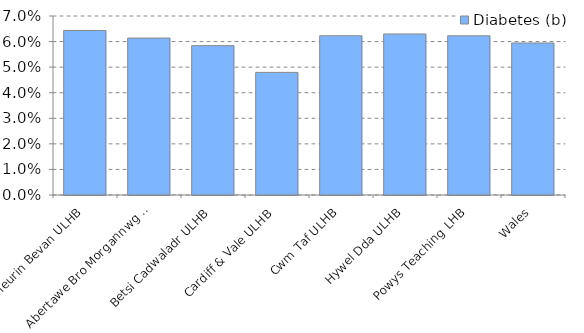
| Category | Diabetes (b) |
|---|---|
| Aneurin Bevan ULHB | 0.064 |
| Abertawe Bro Morgannwg ULHB | 0.061 |
| Betsi Cadwaladr ULHB | 0.058 |
| Cardiff & Vale ULHB | 0.048 |
| Cwm Taf ULHB | 0.062 |
| Hywel Dda ULHB | 0.063 |
| Powys Teaching LHB | 0.062 |
| Wales | 0.059 |